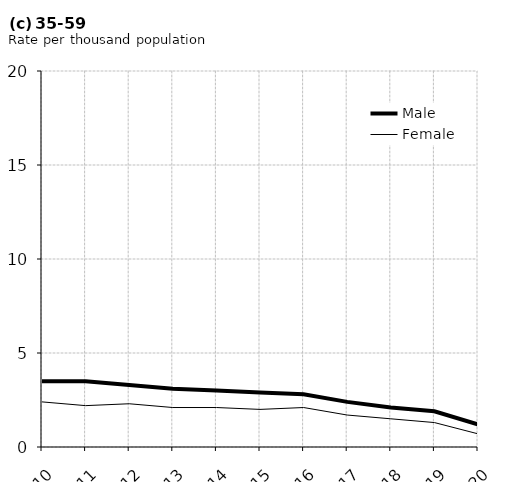
| Category | Male | Female |
|---|---|---|
| 2010.0 | 3.5 | 2.4 |
| 2011.0 | 3.5 | 2.2 |
| 2012.0 | 3.3 | 2.3 |
| 2013.0 | 3.1 | 2.1 |
| 2014.0 | 3 | 2.1 |
| 2015.0 | 2.9 | 2 |
| 2016.0 | 2.8 | 2.1 |
| 2017.0 | 2.4 | 1.7 |
| 2018.0 | 2.1 | 1.5 |
| 2019.0 | 1.9 | 1.3 |
| 2020.0 | 1.2 | 0.7 |